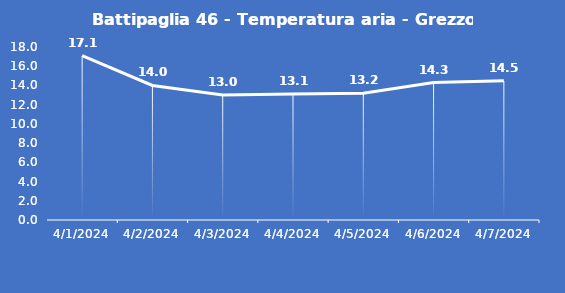
| Category | Battipaglia 46 - Temperatura aria - Grezzo (°C) |
|---|---|
| 4/1/24 | 17.1 |
| 4/2/24 | 14 |
| 4/3/24 | 13 |
| 4/4/24 | 13.1 |
| 4/5/24 | 13.2 |
| 4/6/24 | 14.3 |
| 4/7/24 | 14.5 |